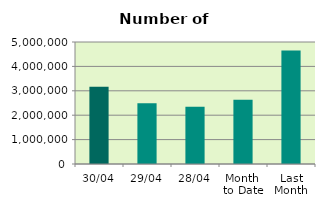
| Category | Series 0 |
|---|---|
| 30/04 | 3170270 |
| 29/04 | 2492624 |
| 28/04 | 2349432 |
| Month 
to Date | 2628131 |
| Last
Month | 4654844.727 |